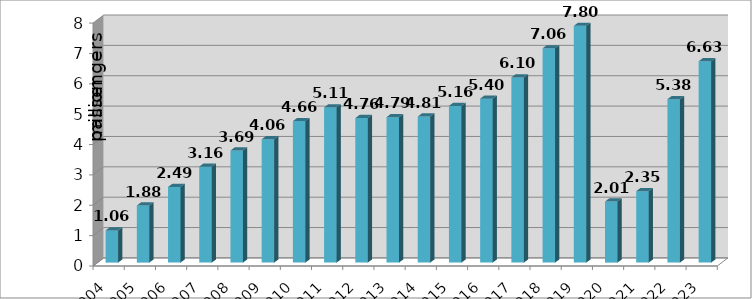
| Category | Series 0 |
|---|---|
| 2004.0 | 1.06 |
| 2005.0 | 1.88 |
| 2006.0 | 2.49 |
| 2007.0 | 3.16 |
| 2008.0 | 3.69 |
| 2009.0 | 4.06 |
| 2010.0 | 4.66 |
| 2011.0 | 5.11 |
| 2012.0 | 4.76 |
| 2013.0 | 4.79 |
| 2014.0 | 4.81 |
| 2015.0 | 5.16 |
| 2016.0 | 5.4 |
| 2017.0 | 6.1 |
| 2018.0 | 7.056 |
| 2019.0 | 7.797 |
| 2020.0 | 2.011 |
| 2021.0 | 2.353 |
| 2022.0 | 5.381 |
| 2023.0 | 6.631 |